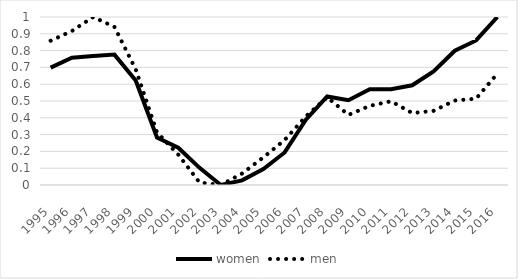
| Category | women | men |
|---|---|---|
| 1995-01-01 | 0.699 | 0.859 |
| 1996-01-01 | 0.758 | 0.917 |
| 1997-01-01 | 0.768 | 1 |
| 1998-01-01 | 0.776 | 0.941 |
| 1999-01-01 | 0.622 | 0.688 |
| 2000-01-01 | 0.282 | 0.313 |
| 2001-01-01 | 0.222 | 0.181 |
| 2002-01-01 | 0.102 | 0.015 |
| 2003-01-01 | 0 | 0 |
| 2004-01-01 | 0.028 | 0.068 |
| 2005-01-01 | 0.095 | 0.164 |
| 2006-01-01 | 0.194 | 0.268 |
| 2007-01-01 | 0.388 | 0.409 |
| 2008-01-01 | 0.527 | 0.523 |
| 2009-01-01 | 0.505 | 0.417 |
| 2010-01-01 | 0.57 | 0.471 |
| 2011-01-01 | 0.57 | 0.498 |
| 2012-01-01 | 0.594 | 0.428 |
| 2013-01-01 | 0.676 | 0.441 |
| 2014-01-01 | 0.799 | 0.503 |
| 2015-01-01 | 0.86 | 0.514 |
| 2016-01-01 | 1 | 0.663 |